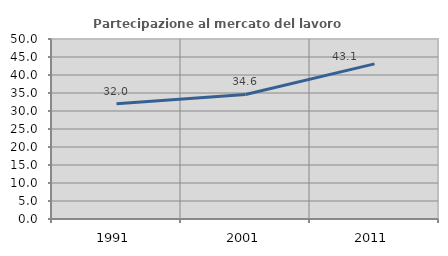
| Category | Partecipazione al mercato del lavoro  femminile |
|---|---|
| 1991.0 | 31.987 |
| 2001.0 | 34.597 |
| 2011.0 | 43.084 |